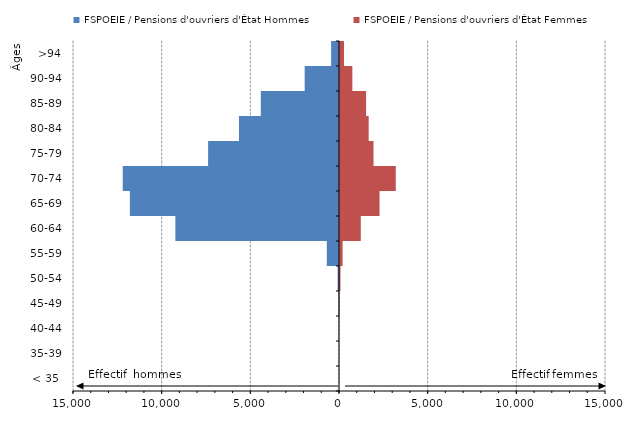
| Category | FSPOEIE / Pensions d'ouvriers d'État Hommes | FSPOEIE / Pensions d'ouvriers d'État Femmes |
|---|---|---|
| < 35  | 0 | 0 |
| 35-39 | -3 | 1 |
| 40-44 | -15 | 2 |
| 45-49 | -26 | 28 |
| 50-54 | -76 | 83 |
| 55-59 | -689 | 203 |
| 60-64 | -9227 | 1229 |
| 65-69 | -11795 | 2286 |
| 70-74 | -12196 | 3202 |
| 75-79 | -7382 | 1946 |
| 80-84 | -5641 | 1674 |
| 85-89 | -4409 | 1528 |
| 90-94 | -1936 | 753 |
| >94 | -445 | 281 |